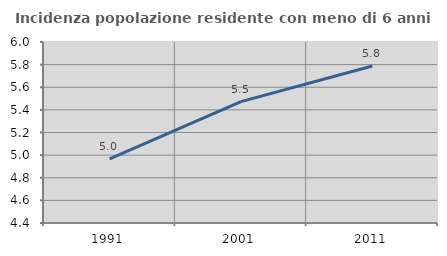
| Category | Incidenza popolazione residente con meno di 6 anni |
|---|---|
| 1991.0 | 4.966 |
| 2001.0 | 5.473 |
| 2011.0 | 5.788 |